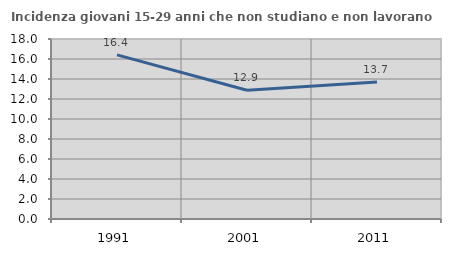
| Category | Incidenza giovani 15-29 anni che non studiano e non lavorano  |
|---|---|
| 1991.0 | 16.41 |
| 2001.0 | 12.877 |
| 2011.0 | 13.693 |